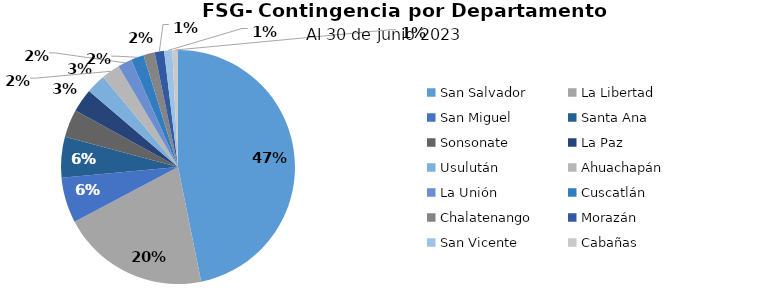
| Category | Saldo |
|---|---|
| San Salvador | 64.832 |
| La Libertad | 28.303 |
| San Miguel | 8.664 |
| Santa Ana | 7.794 |
| Sonsonate | 5.336 |
| La Paz | 4.504 |
| Usulután | 3.748 |
| Ahuachapán | 3.526 |
| La Unión | 2.69 |
| Cuscatlán | 2.485 |
| Chalatenango | 2.15 |
| Morazán | 1.8 |
| San Vicente | 1.561 |
| Cabañas | 1.071 |